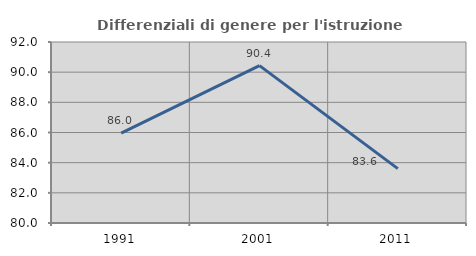
| Category | Differenziali di genere per l'istruzione superiore |
|---|---|
| 1991.0 | 85.957 |
| 2001.0 | 90.432 |
| 2011.0 | 83.603 |